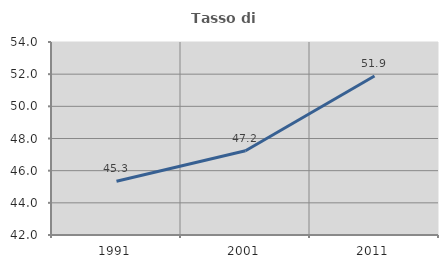
| Category | Tasso di occupazione   |
|---|---|
| 1991.0 | 45.34 |
| 2001.0 | 47.241 |
| 2011.0 | 51.884 |